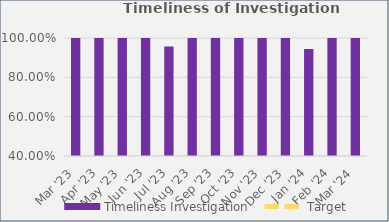
| Category | Timeliness Investigation |
|---|---|
| Mar '23 | 1 |
| Apr '23 | 1 |
| May '23 | 1 |
| Jun '23 | 1 |
| Jul '23 | 0.957 |
| Aug '23 | 1 |
| Sep '23 | 1 |
| Oct '23 | 1 |
| Nov '23 | 1 |
| Dec '23 | 1 |
| Jan '24 | 0.944 |
| Feb '24 | 1 |
| Mar '24 | 1 |